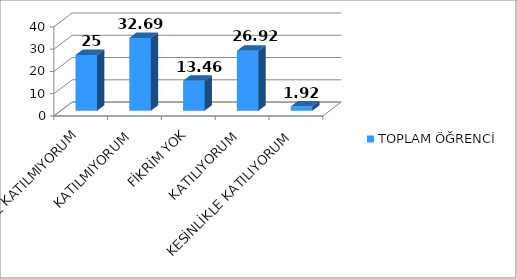
| Category | TOPLAM ÖĞRENCİ |
|---|---|
| KESİNLİKLE KATILMIYORUM | 25 |
| KATILMIYORUM | 32.69 |
| FİKRİM YOK | 13.46 |
| KATILIYORUM | 26.92 |
| KESİNLİKLE KATILIYORUM | 1.92 |